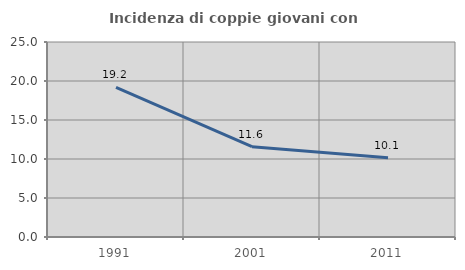
| Category | Incidenza di coppie giovani con figli |
|---|---|
| 1991.0 | 19.178 |
| 2001.0 | 11.577 |
| 2011.0 | 10.145 |